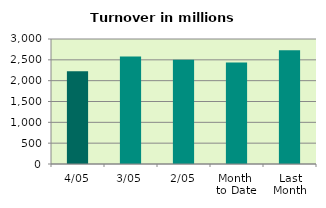
| Category | Series 0 |
|---|---|
| 4/05 | 2227.427 |
| 3/05 | 2582.797 |
| 2/05 | 2504.432 |
| Month 
to Date | 2438.219 |
| Last
Month | 2727.753 |